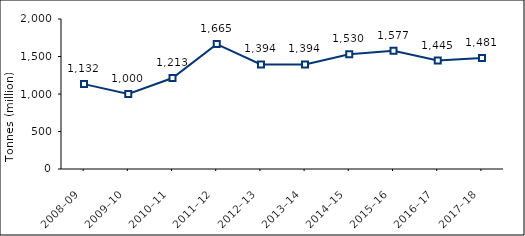
| Category | Total paper and cardboard |
|---|---|
| 2008–09 | 1131716 |
| 2009–10 | 1000134 |
| 2010–11 | 1212848 |
| 2011–12 | 1665218 |
| 2012–13 | 1393582 |
| 2013–14 | 1393518 |
| 2014–15 | 1530187 |
| 2015–16 | 1577337 |
| 2016–17 | 1445332 |
| 2017–18 | 1481017 |